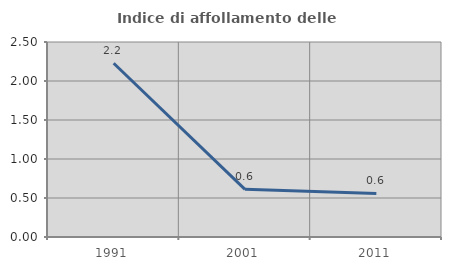
| Category | Indice di affollamento delle abitazioni  |
|---|---|
| 1991.0 | 2.227 |
| 2001.0 | 0.612 |
| 2011.0 | 0.558 |